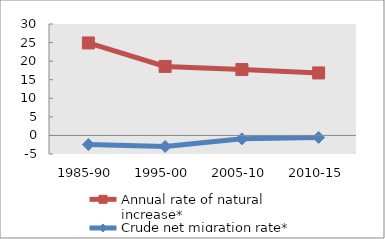
| Category | Annual rate of natural increase* | Crude net migration rate* |
|---|---|---|
| 1985-90 | 24.903 | -2.444 |
| 1995-00 | 18.582 | -2.971 |
| 2005-10 | 17.737 | -0.926 |
| 2010-15 | 16.821 | -0.53 |